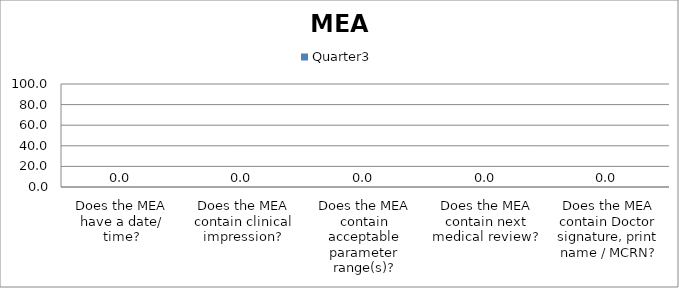
| Category | Quarter3 |
|---|---|
| Does the MEA have a date/ time? | 0 |
| Does the MEA contain clinical impression? | 0 |
| Does the MEA contain acceptable parameter range(s)? | 0 |
| Does the MEA contain next medical review? | 0 |
| Does the MEA contain Doctor signature, print name / MCRN? | 0 |